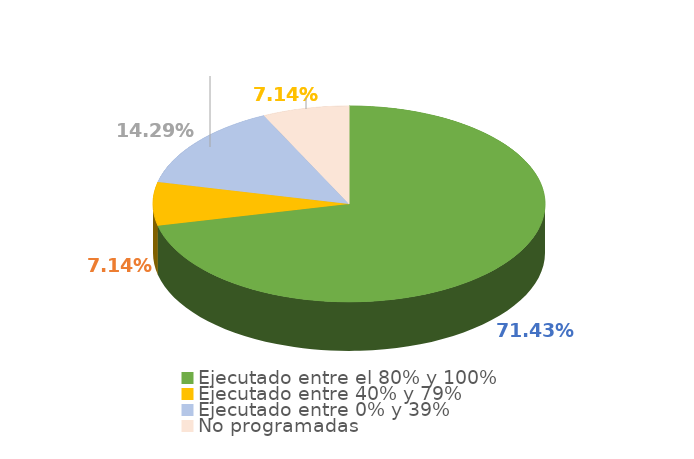
| Category | Series 0 |
|---|---|
| Ejecutado entre el 80% y 100% | 0.714 |
| Ejecutado entre 40% y 79% | 0.071 |
| Ejecutado entre 0% y 39% | 0.143 |
| No programadas | 0.071 |